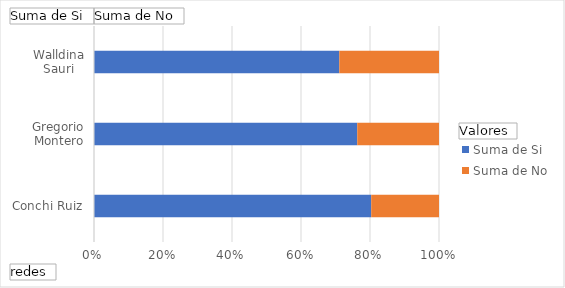
| Category | Suma de Si | Suma de No |
|---|---|---|
| Conchi Ruiz | 0.803 | 0.197 |
| Gregorio Montero | 0.763 | 0.237 |
| Walldina Sauri | 0.711 | 0.289 |